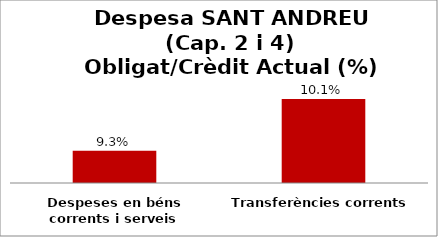
| Category | Series 0 |
|---|---|
| Despeses en béns corrents i serveis | 0.093 |
| Transferències corrents | 0.101 |